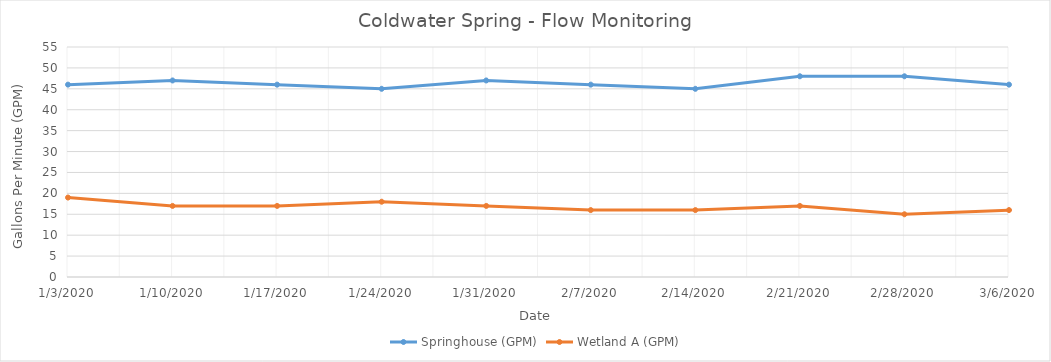
| Category | Springhouse (GPM) | Wetland A (GPM) |
|---|---|---|
| 1/3/20 | 46 | 19 |
| 1/10/20 | 47 | 17 |
| 1/17/20 | 46 | 17 |
| 1/24/20 | 45 | 18 |
| 1/31/20 | 47 | 17 |
| 2/7/20 | 46 | 16 |
| 2/14/20 | 45 | 16 |
| 2/21/20 | 48 | 17 |
| 2/28/20 | 48 | 15 |
| 3/6/20 | 46 | 16 |